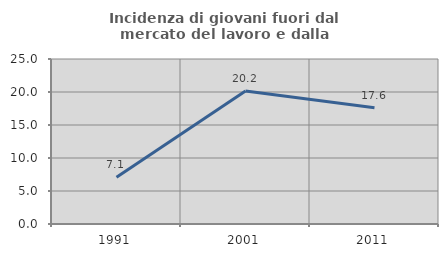
| Category | Incidenza di giovani fuori dal mercato del lavoro e dalla formazione  |
|---|---|
| 1991.0 | 7.101 |
| 2001.0 | 20.164 |
| 2011.0 | 17.625 |